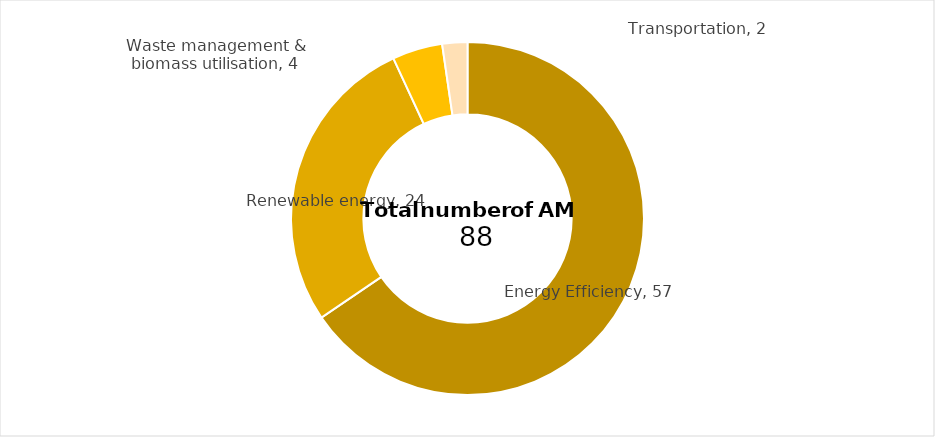
| Category | Series 0 |
|---|---|
| 0 | 57 |
| 1 | 24 |
| 2 | 4 |
| 3 | 2 |